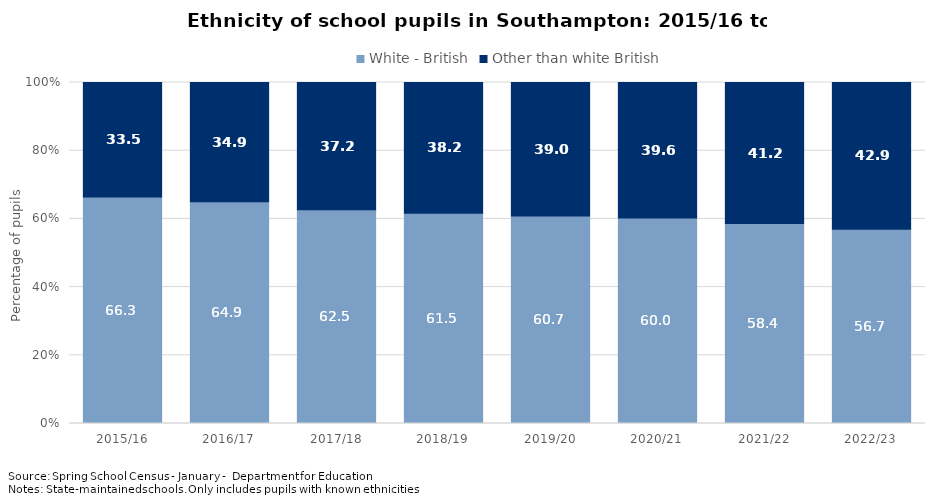
| Category | White - British | Other than white British |
|---|---|---|
| 2015/16 | 66.269 | 33.495 |
| 2016/17 | 64.926 | 34.914 |
| 2017/18 | 62.509 | 37.189 |
| 2018/19 | 61.454 | 38.178 |
| 2019/20 | 60.651 | 38.962 |
| 2020/21 | 60.009 | 39.578 |
| 2021/22 | 58.399 | 41.216 |
| 2022/23 | 56.673 | 42.873 |